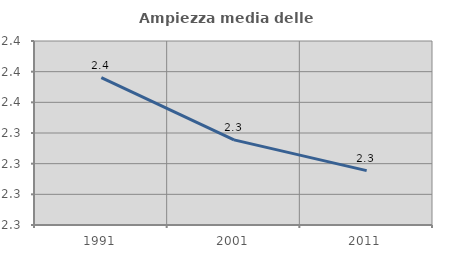
| Category | Ampiezza media delle famiglie |
|---|---|
| 1991.0 | 2.376 |
| 2001.0 | 2.335 |
| 2011.0 | 2.315 |